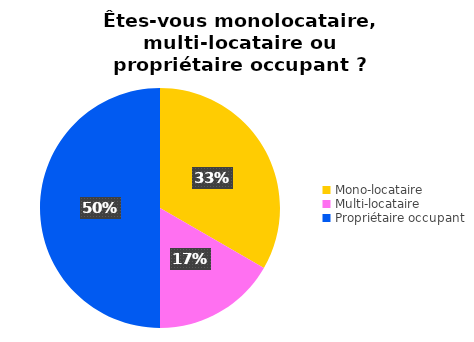
| Category | Series 1 |
|---|---|
| Mono-locataire | 2 |
| Multi-locataire | 1 |
| Propriétaire occupant | 3 |